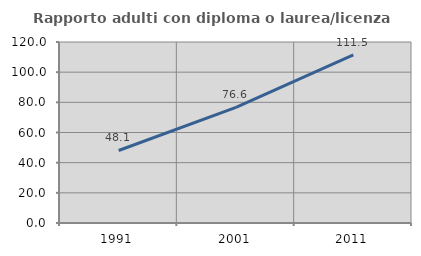
| Category | Rapporto adulti con diploma o laurea/licenza media  |
|---|---|
| 1991.0 | 48.08 |
| 2001.0 | 76.62 |
| 2011.0 | 111.477 |